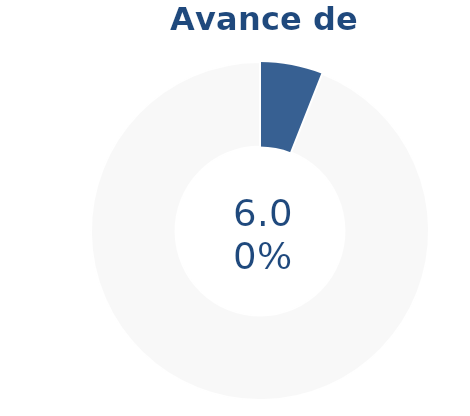
| Category | Series 0 |
|---|---|
| Acumulado 1 Trimestre | 0.06 |
| Año | -0.94 |